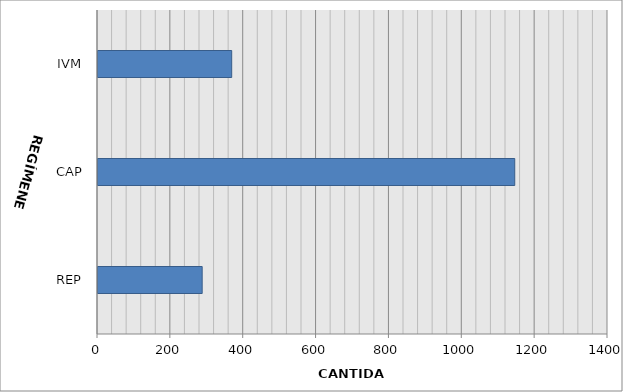
| Category | Series 0 |
|---|---|
| REP | 286 |
| CAP | 1144 |
| IVM | 367 |